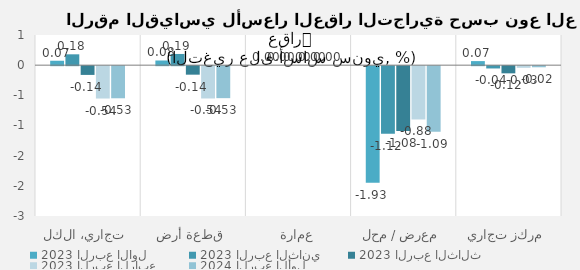
| Category | 2023 | 2024 |
|---|---|---|
| تجاري، الكل | -0.536 | -0.532 |
| قطعة أرض | -0.536 | -0.53 |
| عمارة | 0 | 0 |
| معرض / محل | -0.884 | -1.086 |
| مركز تجاري | -0.027 | -0.019 |